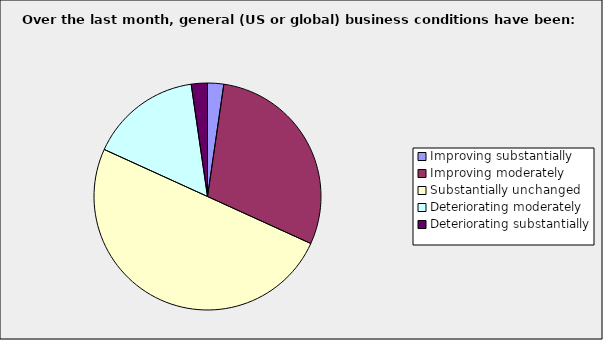
| Category | Series 0 |
|---|---|
| Improving substantially | 0.023 |
| Improving moderately | 0.295 |
| Substantially unchanged | 0.5 |
| Deteriorating moderately | 0.159 |
| Deteriorating substantially | 0.023 |